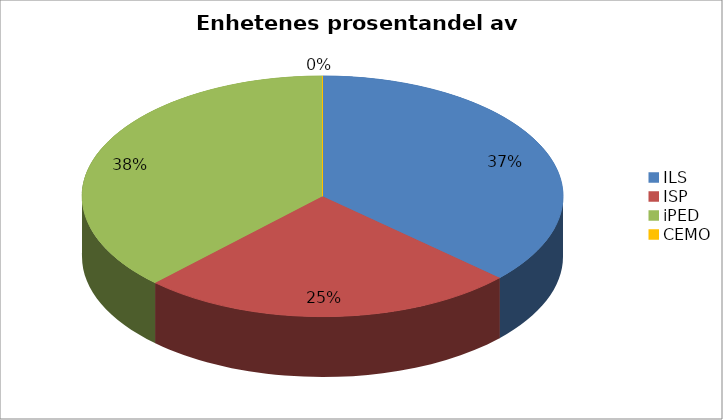
| Category | Series 0 |
|---|---|
| ILS | 13743062.908 |
| ISP | 9474908.217 |
| iPED | 14093802.472 |
| CEMO | 0 |